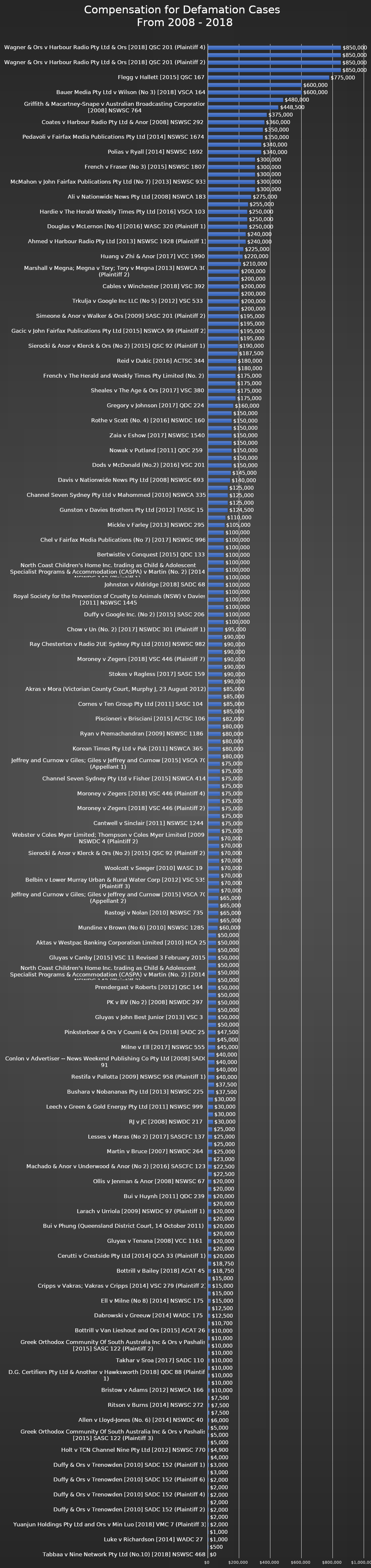
| Category | Series 0 |
|---|---|
| Tabbaa v Nine Network Pty Ltd (No.10) [2018] NSWSC 468 | 0 |
| Yuanjun Holdings Pty Ltd and Ors v Min Luo [2018] VMC 7 (Plaintiff 1) | 500 |
| Luke v Richardson [2014] WADC 27  | 1000 |
| Yuanjun Holdings Pty Ltd and Ors v Min Luo [2018] VMC 7 (Plaintiff 2) | 1000 |
| Yuanjun Holdings Pty Ltd and Ors v Min Luo [2018] VMC 7 (Plaintiff 3) | 2000 |
| Stone v Moore [2016] SASCFC 50 | 2000 |
| Duffy & Ors v Trenowden [2010] SADC 152 (Plaintiff 2) | 2000 |
| Duffy & Ors v Trenowden [2010] SADC 152 (Plaintiff 3) | 2000 |
| Duffy & Ors v Trenowden [2010] SADC 152 (Plaintiff 4) | 2000 |
| Duffy & Ors v Trenowden [2010] SADC 152 (Plaintiff 5) | 2000 |
| Duffy & Ors v Trenowden [2010] SADC 152 (Plaintiff 6) | 2000 |
| Smith v Stevens [2018] WASC 95 | 3000 |
| Duffy & Ors v Trenowden [2010] SADC 152 (Plaintiff 1) | 3000 |
| Brennan v Rijicach Pty Ltd & Hickey [2014] SADC 153 | 4000 |
| Holt v TCN Channel Nine Pty Ltd [2012] NSWSC 770 | 4900 |
| Amanatidis v Darmos [2011] VSC 163 (Plaintiff 2) | 5000 |
| Greek Orthodox Community Of South Australia Inc & Ors v Pashalis [2015] SASC 122 (Plaintiff 3) | 5000 |
| Habib v Nationwide News Pty Limited [2010] NSWSC 924 | 5000 |
| Allen v Lloyd-Jones (No. 6) [2014] NSWDC 40  | 6000 |
| Ahmadi v Fairfax Media Publications Pty Ltd [2010] NSWSC 702  | 7500 |
| Ritson v Burns [2014] NSWSC 272  | 7500 |
| Piscioneri v Whitaker [2017] ACTSC 174 | 7500 |
| Bristow v Adams [2012] NSWCA 166  | 10000 |
| Amanatidis v Darmos [2011] VSC 163 (Plaintiff 1) | 10000 |
| D.G. Certifiers Pty Ltd & Another v Hawksworth [2018] QDC 88 (Plaintiff 1) | 10000 |
| Smith v Stevens [2018] WASC 95 | 10000 |
| Takhar v Sroa [2017] SADC 110 | 10000 |
| Greek Orthodox Community Of South Australia Inc & Ors v Pashalis [2015] SASC 122 (Plaintiff 1) | 10000 |
| Greek Orthodox Community Of South Australia Inc & Ors v Pashalis [2015] SASC 122 (Plaintiff 2) | 10000 |
| Kelly v Levick [2016] QMC 11 | 10000 |
| Bottrill v Van Lieshout and Ors [2015] ACAT 26 | 10000 |
| Newman v Speigler & Anor [2008] QDC 266 | 10700 |
| Dabrowski v Greeuw [2014] WADC 175  | 12500 |
| Pintegne v Woods [2010] NSWDC 44 | 12500 |
| Ell v Milne (No 8) [2014] NSWSC 175  | 15000 |
| D.G. Certifiers Pty Ltd & Another v Hawksworth [2018] QDC 88 (Plaintiff 2) | 15000 |
| Cripps v Vakras; Vakras v Cripps [2014] VSC 279 (Plaintiff 2) | 15000 |
| Bennette v Cohen [2009] NSWCA 60 | 15000 |
| Bottrill v Bailey [2018] ACAT 45 | 18750 |
| Hallam v Ross (No 3) [2012] QSC 421 | 18750 |
| Cerutti v Crestside Pty Ltd [2014] QCA 33 (Plaintiff 1) | 20000 |
| Prince v Malouf [2014] NSWCA 12  | 20000 |
| Gluyas v Tenana [2008] VCC 1161  | 20000 |
| Tropeano v Lauro [2010] SADC 113 | 20000 |
| Bui v Phung (Queensland District Court, 14 October 2011)  | 20000 |
| Scali v Scali [2015] SADC 172 | 20000 |
| Larach v Urriola [2009] NSWDC 97 (Plaintiff 1) | 20000 |
| Larach v Urriola [2009] NSWDC 97 (Plaintiff 2) | 20000 |
| Bui v Huynh [2011] QDC 239 | 20000 |
| P L & Anor v W J A [2008] QDC 34 (Plaintiff 2) | 20000 |
| Ollis v Jenman & Anor [2008] NSWSC 67 | 20000 |
| Machado & Anor v Underwood & Anor (No 2) [2016] SASCFC 123 | 22500 |
| Machado & Anor v Underwood & Anor (No 2) [2016] SASCFC 123 | 22500 |
| Cerutti v Crestside Pty Ltd [2014] QCA 33 (Plaintiff 2) | 23000 |
| Martin v Bruce [2007] NSWDC 264  | 25000 |
| Perkins v Floradale Productions Pty Ltd & Ors (District Court of NSW, Walmsley SC DCJ, 28 May 2013)  | 25000 |
| Lesses v Maras (No 2) [2017] SASCFC 137 | 25000 |
| Beynon v Manthey [2015] QDC 252 | 25000 |
| RJ v JC [2008] NSWDC 217  | 30000 |
| Winn v Goodwin [2008] VCC 1507  | 30000 |
| Leech v Green & Gold Energy Pty Ltd [2011] NSWSC 999  | 30000 |
| P L & Anor v W J A [2008] QDC 34 (Plaintiff 1) | 30000 |
| Bushara v Nobananas Pty Ltd [2013] NSWSC 225  | 37500 |
| Anderson v Gregory [2008] QDC 135 | 37500 |
| Restifa v Pallotta [2009] NSWSC 958 (Plaintiff 1) | 40000 |
| Restifa v Pallotta [2009] NSWSC 958 (Plaintiff 2) | 40000 |
| Conlon v Advertiser -- News Weekend Publishing Co Pty Ltd [2008] SADC 91 | 40000 |
| Ahmed v Harbour Radio Pty Ltd [2013] NSWSC 1928 (Plaintiff 2) | 40000 |
| Milne v Ell [2017] NSWSC 555 | 45000 |
| Stevens v Mayberry [2012] SASC 220 | 45000 |
| Pinksterboer & Ors V Coumi & Ors [2018] SADC 25 | 47500 |
| Phillips v Robab Pty Limited [2014] NSWSC 1520  | 50000 |
| Gluyas v John Best Junior [2013] VSC 3  | 50000 |
| Gluyas v Canby [2015] VSC 11  | 50000 |
| PK v BV (No 2) [2008] NSWDC 297  | 50000 |
| Moumoutzakis v Carpino [2008] NSWDC 168  | 50000 |
| Prendergast v Roberts [2012] QSC 144  | 50000 |
| Clarke v Coles Supermarkets Australia Pty Limited [2012] NSWDC 107  | 50000 |
| North Coast Children's Home Inc. trading as Child & Adolescent Specialist Programs & Accommodation (CASPA) v Martin (No. 2) [2014] NSWDC 142 (Plaintiff 3) | 50000 |
| Stevens v Boyle [2012] SASC 232  | 50000 |
| Gluyas v Canby [2015] VSC 11 Revised 3 February 2015 | 50000 |
| Dossis v Andreadis (No 4) [2012] SADC 114 | 50000 |
| Aktas v Westpac Banking Corporation Limited [2010] HCA 25 | 50000 |
| Webster v Coles Myer Limited; Thompson v Coles Myer Limited [2009] NSWDC 4 (Plaintiff 1) | 50000 |
| Mundine v Brown (No 6) [2010] NSWSC 1285  | 60000 |
| Naudin-Dovey v Naudin & Ors [2013] QDC 119  | 65000 |
| Rastogi v Nolan [2010] NSWSC 735  | 65000 |
| Chow v Un (No. 2) [2017] NSWDC 301 (Plaintiff 2) | 65000 |
| Jeffrey and Curnow v Giles; Giles v Jeffrey and Curnow [2015] VSCA 70 (Appellant 2) | 65000 |
| Belbin v Lower Murray Urban & Rural Water Corp [2012] VSC 535 (Plaintiff 1) | 70000 |
| Belbin v Lower Murray Urban & Rural Water Corp [2012] VSC 535 (Plaintiff 3) | 70000 |
| Belbin v Lower Murray Urban & Rural Water Corp [2012] VSC 535 (Plaintiff 2) | 70000 |
| Woolcott v Seeger [2010] WASC 19  | 70000 |
| Linsley v Domaille (aka James) [2009] VCC 554  | 70000 |
| Sierocki & Anor v Klerck & Ors (No 2) [2015] QSC 92 (Plaintiff 2) | 70000 |
| Cripps v Vakras; Vakras v Cripps [2014] VSC 279 (Plaintiff 1) | 70000 |
| Webster v Coles Myer Limited; Thompson v Coles Myer Limited [2009] NSWDC 4 (Plaintiff 2) | 70000 |
| Hocken v Morris [2011] QDC 115  | 75000 |
| Cantwell v Sinclair [2011] NSWSC 1244  | 75000 |
| Moroney v Zegers [2018] VSC 446 (Plaintiff 1) | 75000 |
| Moroney v Zegers [2018] VSC 446 (Plaintiff 2) | 75000 |
| Moroney v Zegers [2018] VSC 446 (Plaintiff 3) | 75000 |
| Moroney v Zegers [2018] VSC 446 (Plaintiff 4) | 75000 |
| Moroney v Zegers [2018] VSC 446 (Plaintiff 8) | 75000 |
| Channel Seven Sydney Pty Ltd v Fisher [2015] NSWCA 414 | 75000 |
| De Poi v Advertiser-news Weekend Publishing Company Pty Ltd [2016] SASCFC 45 | 75000 |
| Jeffrey and Curnow v Giles; Giles v Jeffrey and Curnow [2015] VSCA 70 (Appellant 1) | 75000 |
| Graham v Powell (No 4) [2014] NSWSC 1319  | 80000 |
| Korean Times Pty Ltd v Pak [2011] NSWCA 365  | 80000 |
| Shandil v Sharma [2010] NSWDC 273  | 80000 |
| Ryan v Premachandran [2009] NSWSC 1186  | 80000 |
| Moroney v Zegers [2018] VSC 446 (Plaintiff 5) | 80000 |
| Piscioneri v Brisciani [2015] ACTSC 106 | 82000 |
| Smith v Mather (Queensland District Court, Clare SC DCJ, 31 October 2013)  | 85000 |
| Cornes v Ten Group Pty Ltd [2011] SASC 104  | 85000 |
| Belbin v Lower Murray Urban & Rural Water Corp [2012] VSC 535 (Fourth Plaintiff) | 85000 |
| Akras v Mora (Victorian County Court, Murphy J, 23 August 2012) | 85000 |
| Visscher v Maritime Union of Australia (No 6) [2014] NSWSC 350  | 90000 |
| Stokes v Ragless [2017] SASC 159 | 90000 |
| Visscher v Maritime Union of Australia (No 6) [2014] NSWSC 350  | 90000 |
| Moroney v Zegers [2018] VSC 446 (Plaintiff 7) | 90000 |
| Moroney v Zegers [2018] VSC 446 (Plaintiff 6) | 90000 |
| Ray Chesterton v Radio 2UE Sydney Pty Ltd [2010] NSWSC 982 | 90000 |
| Foley v Radford [2008] NSWDC 167 | 90000 |
| Chow v Un (No. 2) [2017] NSWDC 301 (Plaintiff 1) | 95000 |
| Weatherup v Nationwide News Pty Ltd [2016] QSC 266  | 100000 |
| Duffy v Google Inc. (No 2) [2015] SASC 206 | 100000 |
| Higgins v Sinclair [2011] NSWSC 163  | 100000 |
| Royal Society for the Prevention of Cruelty to Animals (NSW) v Davies [2011] NSWSC 1445  | 100000 |
| Forrest v Chlanda [2012] NTSC 14  | 100000 |
| Johnston v Aldridge [2018] SADC 68 | 100000 |
| Cheikho v Nationwide News Pty Ltd (No 5) [2016] NSWSC 29 | 100000 |
| North Coast Children's Home Inc. trading as Child & Adolescent Specialist Programs & Accommodation (CASPA) v Martin (No. 2) [2014] NSWDC 142 (Plaintiff 1) | 100000 |
| North Coast Children's Home Inc. trading as Child & Adolescent Specialist Programs & Accommodation (CASPA) v Martin (No. 2) [2014] NSWDC 142 (Plaintiff 2) | 100000 |
| Bertwistle v Conquest [2015] QDC 133 | 100000 |
| Weatherup v Nationwide News Pty Ltd [2016] QSC 266 | 100000 |
| Chel v Fairfax Media Publications (No 7) [2017] NSWSC 996 | 100000 |
| Trenham v Platinum Traders Pty Ltd & Anor [2012] QDC 347 | 100000 |
| Mickle v Farley [2013] NSWDC 295 | 105000 |
| Attrill v Christie [2007] NSWSC 1386  | 110000 |
| Gunston v Davies Brothers Pty Ltd [2012] TASSC 15  | 124500 |
| Kunoth-Monks v Healy and Anor [2013] NTSC 74  | 125000 |
| Channel Seven Sydney Pty Ltd v Mahommed [2010] NSWCA 335 | 125000 |
| Ayan v Islamic Co-ordinating Council of Victoria Pty Ltd & Ors [2009] VSC 119 | 125000 |
| Davis v Nationwide News Pty Ltd [2008] NSWSC 693  | 140000 |
| Habib v Radio 2UE Sydney Pty Ltd & Anor (No 4) [2012] NSWDC 12 | 145000 |
| Dods v McDonald (No.2) [2016] VSC 201 | 150000 |
| Manefield v Association of Quality Child Care Centres of NSW Inc [2010] NSWSC 1420  | 150000 |
| Nowak v Putland [2011] QDC 259  | 150000 |
| Fraser v Business News Group Pty Ltd [2018] VSC 196 | 150000 |
| Zaia v Eshow [2017] NSWSC 1540 | 150000 |
| Zoef v Nationwide News Pty Ltd [2016] NSWCA 283 | 150000 |
| Rothe v Scott (No. 4) [2016] NSWDC 160 | 150000 |
| Grattan v Porter [2016] QDC 202 | 150000 |
| Gregory v Johnson [2017] QDC 224 | 160000 |
| Tassone v Kirkham [2014] SADC 134 | 175000 |
| Sheales v The Age & Ors [2017] VSC 380 | 175000 |
| Moroney v Zegers [2018] VSC 446 (Jack Wegman) | 175000 |
| French v The Herald and Weekly Times Pty Limited (No. 2) | 175000 |
| Zwambila v Wafawarova [2015] ACTSC 171 | 180000 |
| Reid v Dukic [2016] ACTSC 344 | 180000 |
| Simeone & Anor v Walker & Ors [2009] SASC 201 (Plaintiff 1) | 187500 |
| Sierocki & Anor v Klerck & Ors (No 2) [2015] QSC 92 (Plaintiff 1) | 190000 |
| Gacic v John Fairfax Publications Pty Ltd [2015] NSWCA 99 (Plaintiff 1) | 195000 |
| Gacic v John Fairfax Publications Pty Ltd [2015] NSWCA 99 (Plaintiff 2) | 195000 |
| Gacic v John Fairfax Publications Pty Ltd [2015] NSWCA 99 (Plaintiff 3) | 195000 |
| Simeone & Anor v Walker & Ors [2009] SASC 201 (Plaintiff 2) | 195000 |
| Douglas v McLernon [No 4] [2016] WASC 320 (Plaintiff 3) | 200000 |
| Trkulja v Google Inc LLC (No 5) [2012] VSC 533  | 200000 |
| Greig v WIN Television NSW Pty Ltd [2009] NSWSC 632  | 200000 |
| Cables v Winchester [2018] VSC 392 | 200000 |
| Hockey v Fairfax Media Publications Pty Ltd [2015] FCA 652 | 200000 |
| Marshall v Megna; Megna v Tory; Tory v Megna [2013] NSWCA 30 (Plaintiff 2) | 200000 |
| Smith v Dahlenburg [2008] VSC 557  | 210000 |
| Huang v Zhi & Anor [2017] VCC 1990 | 220000 |
| Trkulja v Yahoo! Inc LLC [2012] VSC 88  | 225000 |
| Ahmed v Harbour Radio Pty Ltd [2013] NSWSC 1928 (Plaintiff 1) | 240000 |
| Cha v Oh (No. 22) (Part 2) [2009] NSWDC 300 | 240000 |
| Douglas v McLernon [No 4] [2016] WASC 320 (Plaintiff 1) | 250000 |
| Douglas v McLernon [No 4] [2016] WASC 320 (Plaintiff 2) | 250000 |
| Hardie v The Herald Weekly Times Pty Ltd [2016] VSCA 103 | 250000 |
| Haertsch v Channel Nine Pty Ltd [2010] NSWSC 182  | 255000 |
| Ali v Nationwide News Pty Ltd [2008] NSWCA 183 | 275000 |
| Carolan v Fairfax Media Publications Pty Ltd (No 6) [2016] NSWSC 1091 | 300000 |
| McMahon v John Fairfax Publications Pty Ltd (No 7) [2013] NSWSC 933 | 300000 |
| Pahuja v TCN Channel Nine Pty Ltd (No 3) [2018] NSWSC 893 | 300000 |
| French v Fraser (No 3) [2015] NSWSC 1807 | 300000 |
| Marshall v Megna; Megna v Tory; Tory v Megna [2013] NSWCA 30 (Plaintiff 1) | 300000 |
| Polias v Ryall [2014] NSWSC 1692  | 340000 |
| Nicholas Polias v Tobin Ryall [2014] NSWSC 1692 | 340000 |
| Pedavoli v Fairfax Media Publications Pty Ltd [2014] NSWSC 1674  | 350000 |
| Petrov v Do [2012] NSWSC 1382  | 350000 |
| Coates v Harbour Radio Pty Ltd & Anor [2008] NSWSC 292  | 360000 |
| Lewincamp v ACP Magazines Limited [2008] ACTSC 69 | 375000 |
| Griffith & Macartney-Snape v Australian Broadcasting Corporation [2008] NSWSC 764 | 448500 |
| Al Muderis v Duncan (No 3) [2017] NSWSC 726 | 480000 |
| Bauer Media Pty Ltd v Wilson (No 3) [2018] VSCA 164 | 600000 |
| Rayney v The State of Western Australia [No 9] [2017] WASC 367 | 600000 |
| Flegg v Hallett [2015] QSC 167 | 775000 |
| Wagner & Ors v Harbour Radio Pty Ltd & Ors [2018] QSC 201 (Plaintiff 1) | 850000 |
| Wagner & Ors v Harbour Radio Pty Ltd & Ors [2018] QSC 201 (Plaintiff 2) | 850000 |
| Wagner & Ors v Harbour Radio Pty Ltd & Ors [2018] QSC 201 (Plaintiff 3) | 850000 |
| Wagner & Ors v Harbour Radio Pty Ltd & Ors [2018] QSC 201 (Plaintiff 4) | 850000 |